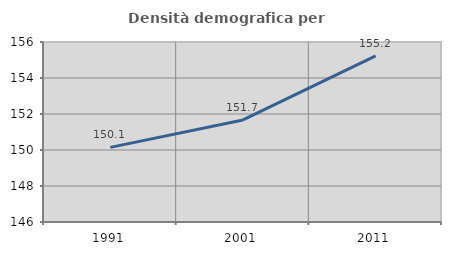
| Category | Densità demografica |
|---|---|
| 1991.0 | 150.145 |
| 2001.0 | 151.67 |
| 2011.0 | 155.229 |